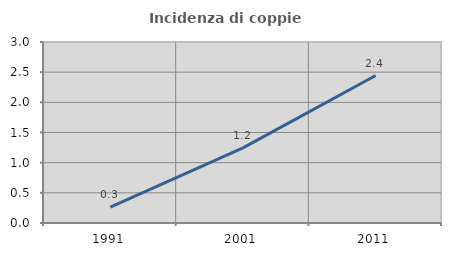
| Category | Incidenza di coppie miste |
|---|---|
| 1991.0 | 0.262 |
| 2001.0 | 1.246 |
| 2011.0 | 2.445 |